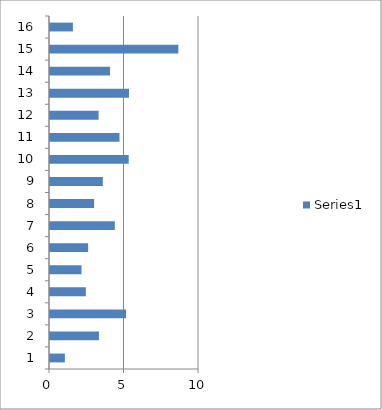
| Category | Series 0 |
|---|---|
| 0 | 1 |
| 1 | 3.285 |
| 2 | 5.103 |
| 3 | 2.404 |
| 4 | 2.115 |
| 5 | 2.559 |
| 6 | 4.351 |
| 7 | 2.961 |
| 8 | 3.546 |
| 9 | 5.283 |
| 10 | 4.663 |
| 11 | 3.262 |
| 12 | 5.301 |
| 13 | 4.031 |
| 14 | 8.614 |
| 15 | 1.537 |